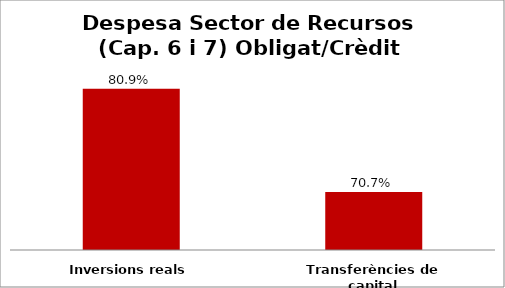
| Category | Series 0 |
|---|---|
| Inversions reals | 0.809 |
| Transferències de capital | 0.707 |